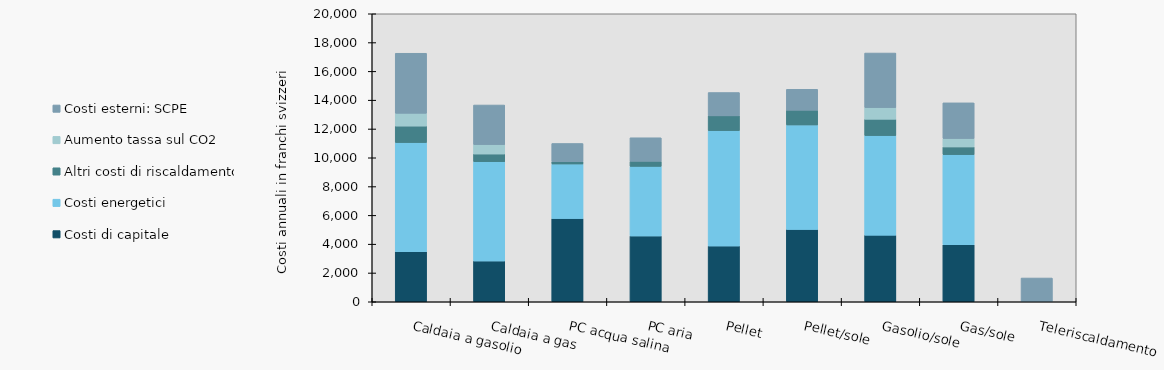
| Category | Costi di capitale | Costi energetici | Altri costi di riscaldamento | Aumento tassa sul CO2 | Costi esterni: SCPE |
|---|---|---|---|---|---|
| Caldaia a gasolio | 3472.538 | 7585.168 | 1144.101 | 888.323 | 4168.183 |
| Caldaia a gas | 2829.36 | 6900.296 | 532 | 652.212 | 2751.001 |
| PC acqua salina | 5779.941 | 3790.265 | 150 | 0 | 1273.612 |
| PC aria | 4568.157 | 4834.627 | 350 | 0 | 1637.501 |
| Pellet | 3870.538 | 8016.077 | 1026.762 | 0 | 1618.236 |
| Pellet/sole | 5022.176 | 7256.469 | 1019.086 | 0 | 1456.412 |
| Gasolio/sole | 4622.334 | 6917.311 | 1137.371 | 807.649 | 3789.644 |
| Gas/sole | 3958.816 | 6261.267 | 532 | 586.991 | 2475.901 |
| Teleriscaldamento | 0 | 0 | 0 | 0 | 1650.601 |